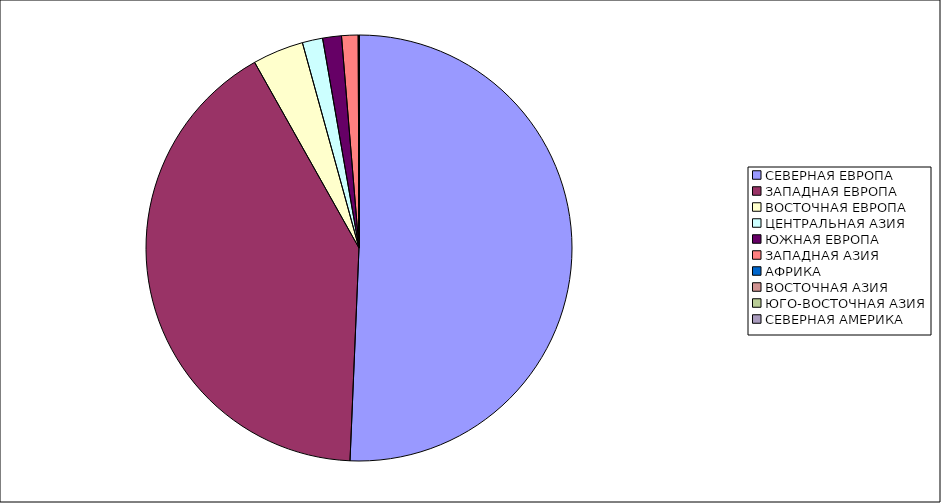
| Category | Оборот |
|---|---|
| СЕВЕРНАЯ ЕВРОПА | 50.672 |
| ЗАПАДНАЯ ЕВРОПА | 41.175 |
| ВОСТОЧНАЯ ЕВРОПА | 3.87 |
| ЦЕНТРАЛЬНАЯ АЗИЯ | 1.543 |
| ЮЖНАЯ ЕВРОПА | 1.427 |
| ЗАПАДНАЯ АЗИЯ | 1.251 |
| АФРИКА | 0.05 |
| ВОСТОЧНАЯ АЗИЯ | 0.009 |
| ЮГО-ВОСТОЧНАЯ АЗИЯ | 0.002 |
| СЕВЕРНАЯ АМЕРИКА | 0 |